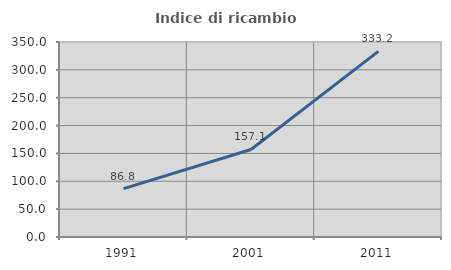
| Category | Indice di ricambio occupazionale  |
|---|---|
| 1991.0 | 86.772 |
| 2001.0 | 157.095 |
| 2011.0 | 333.166 |